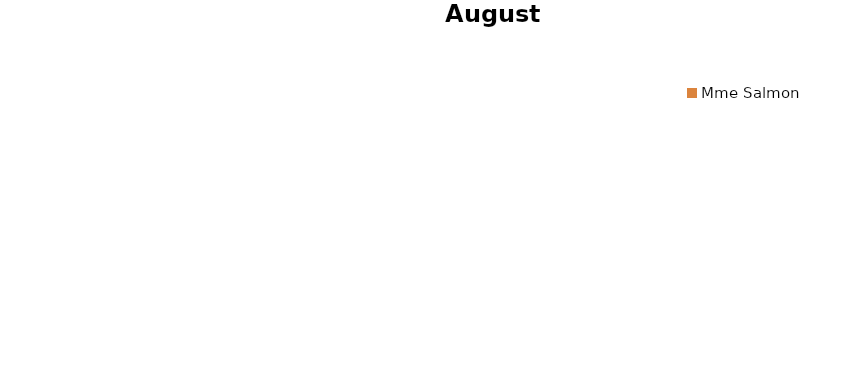
| Category | août 2013 |
|---|---|
| Mme D'Harcourt | 0 |
| Mme Bertrand | 0 |
| Mlle Vanthomme | 0 |
| Mme Tercinier | 0 |
| Mme De Vilelle | 0 |
| Mme Salmon | 0 |